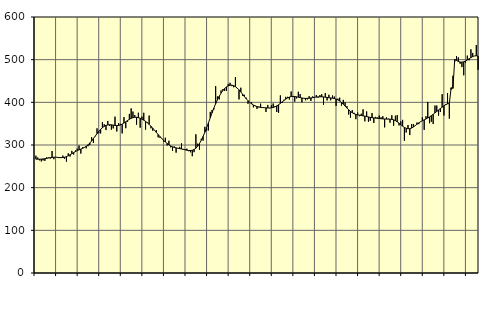
| Category | Piggar | Series 1 |
|---|---|---|
| nan | 274.9 | 266.76 |
| 1.0 | 270.7 | 266.76 |
| 1.0 | 264.1 | 266.82 |
| 1.0 | 261.5 | 266.96 |
| 1.0 | 264 | 267.32 |
| 1.0 | 262.8 | 267.86 |
| 1.0 | 271.2 | 268.57 |
| 1.0 | 270.6 | 269.52 |
| 1.0 | 268 | 270.36 |
| 1.0 | 285.9 | 271.01 |
| 1.0 | 266.7 | 271.34 |
| 1.0 | 271.1 | 271.36 |
| nan | 270.4 | 271.1 |
| 2.0 | 269.3 | 270.68 |
| 2.0 | 271.1 | 270.42 |
| 2.0 | 275.1 | 270.6 |
| 2.0 | 267.8 | 271.37 |
| 2.0 | 261.1 | 272.78 |
| 2.0 | 280.5 | 274.76 |
| 2.0 | 273 | 277.16 |
| 2.0 | 286.3 | 279.71 |
| 2.0 | 277.6 | 282.25 |
| 2.0 | 287.2 | 284.6 |
| 2.0 | 291.5 | 286.7 |
| nan | 298.7 | 288.58 |
| 3.0 | 279.9 | 290.39 |
| 3.0 | 294.8 | 292.26 |
| 3.0 | 295 | 294.38 |
| 3.0 | 292.2 | 297.07 |
| 3.0 | 297.1 | 300.49 |
| 3.0 | 299.8 | 304.65 |
| 3.0 | 318.4 | 309.52 |
| 3.0 | 304.8 | 315.02 |
| 3.0 | 320.2 | 320.77 |
| 3.0 | 339 | 326.52 |
| 3.0 | 327.5 | 331.91 |
| nan | 327.1 | 336.63 |
| 4.0 | 353.4 | 340.6 |
| 4.0 | 348.6 | 343.68 |
| 4.0 | 335 | 345.82 |
| 4.0 | 356.4 | 347.07 |
| 4.0 | 344.6 | 347.5 |
| 4.0 | 336 | 347.3 |
| 4.0 | 338.9 | 346.66 |
| 4.0 | 366.4 | 345.93 |
| 4.0 | 331.7 | 345.59 |
| 4.0 | 351.3 | 345.84 |
| 4.0 | 349.6 | 346.94 |
| nan | 327.2 | 348.92 |
| 5.0 | 365.4 | 351.48 |
| 5.0 | 339.4 | 354.41 |
| 5.0 | 354.5 | 357.47 |
| 5.0 | 372.9 | 360.26 |
| 5.0 | 385.8 | 362.48 |
| 5.0 | 378.4 | 364.04 |
| 5.0 | 370.1 | 364.9 |
| 5.0 | 347.7 | 364.9 |
| 5.0 | 375.6 | 364.09 |
| 5.0 | 340.6 | 362.66 |
| 5.0 | 366.5 | 360.66 |
| nan | 375.5 | 358.22 |
| 6.0 | 336.1 | 355.36 |
| 6.0 | 353.4 | 352.04 |
| 6.0 | 368.9 | 348.28 |
| 6.0 | 339.1 | 344.04 |
| 6.0 | 333.3 | 339.4 |
| 6.0 | 334 | 334.5 |
| 6.0 | 334.7 | 329.5 |
| 6.0 | 317.9 | 324.62 |
| 6.0 | 316.8 | 319.93 |
| 6.0 | 316.4 | 315.39 |
| 6.0 | 308.1 | 311.11 |
| nan | 317.1 | 307.07 |
| 7.0 | 298.7 | 303.42 |
| 7.0 | 310 | 300.32 |
| 7.0 | 294.5 | 297.73 |
| 7.0 | 286.1 | 295.71 |
| 7.0 | 296.6 | 294.33 |
| 7.0 | 282.1 | 293.29 |
| 7.0 | 292.7 | 292.37 |
| 7.0 | 295.6 | 291.51 |
| 7.0 | 303.9 | 290.65 |
| 7.0 | 290.8 | 289.76 |
| 7.0 | 290.6 | 288.76 |
| nan | 291.3 | 287.78 |
| 8.0 | 285.4 | 287.1 |
| 8.0 | 282.8 | 286.96 |
| 8.0 | 273.7 | 287.58 |
| 8.0 | 283.2 | 289.35 |
| 8.0 | 325 | 292.53 |
| 8.0 | 303.2 | 297.2 |
| 8.0 | 289 | 303.42 |
| 8.0 | 314.5 | 311.05 |
| 8.0 | 310.3 | 319.9 |
| 8.0 | 342.7 | 329.81 |
| 8.0 | 333.6 | 340.63 |
| nan | 334 | 352.04 |
| 9.0 | 377.6 | 363.68 |
| 9.0 | 382.2 | 375.25 |
| 9.0 | 383.2 | 386.45 |
| 9.0 | 438 | 396.85 |
| 9.0 | 413.8 | 406.14 |
| 9.0 | 406.9 | 414.33 |
| 9.0 | 427.8 | 421.45 |
| 9.0 | 430.9 | 427.51 |
| 9.0 | 426.6 | 432.4 |
| 9.0 | 427 | 436.12 |
| 9.0 | 443 | 438.66 |
| nan | 445.8 | 440.07 |
| 10.0 | 438 | 440.26 |
| 10.0 | 435.3 | 439.14 |
| 10.0 | 459.4 | 436.83 |
| 10.0 | 432.9 | 433.5 |
| 10.0 | 406.9 | 429.27 |
| 10.0 | 434.3 | 424.32 |
| 10.0 | 415.1 | 418.98 |
| 10.0 | 417.6 | 413.55 |
| 10.0 | 410.9 | 408.44 |
| 10.0 | 396.5 | 403.85 |
| 10.0 | 399.8 | 399.89 |
| nan | 400.1 | 396.52 |
| 11.0 | 388.2 | 393.74 |
| 11.0 | 392.4 | 391.54 |
| 11.0 | 384.5 | 389.89 |
| 11.0 | 390.2 | 388.8 |
| 11.0 | 396.9 | 388.16 |
| 11.0 | 387.1 | 387.78 |
| 11.0 | 387 | 387.43 |
| 11.0 | 377.5 | 387.1 |
| 11.0 | 393.9 | 386.81 |
| 11.0 | 386.2 | 386.76 |
| 11.0 | 392.9 | 387.07 |
| nan | 397.2 | 387.9 |
| 12.0 | 390.7 | 389.4 |
| 12.0 | 377.3 | 391.64 |
| 12.0 | 375.6 | 394.47 |
| 12.0 | 416.2 | 397.66 |
| 12.0 | 398.5 | 401.02 |
| 12.0 | 406.1 | 404.36 |
| 12.0 | 412.8 | 407.5 |
| 12.0 | 412.9 | 410.23 |
| 12.0 | 406.6 | 412.3 |
| 12.0 | 425.4 | 413.56 |
| 12.0 | 412.5 | 414 |
| nan | 401.7 | 413.72 |
| 13.0 | 409.2 | 412.94 |
| 13.0 | 424.8 | 411.95 |
| 13.0 | 419.3 | 410.99 |
| 13.0 | 400.1 | 410.14 |
| 13.0 | 409.2 | 409.51 |
| 13.0 | 404.8 | 409.24 |
| 13.0 | 406.9 | 409.34 |
| 13.0 | 414.3 | 409.71 |
| 13.0 | 403.3 | 410.31 |
| 13.0 | 413.9 | 411 |
| 13.0 | 412.4 | 411.63 |
| nan | 417.2 | 412.27 |
| 14.0 | 411 | 412.8 |
| 14.0 | 416.9 | 413.02 |
| 14.0 | 419 | 412.92 |
| 14.0 | 394.3 | 412.59 |
| 14.0 | 421.9 | 412.09 |
| 14.0 | 404.5 | 411.47 |
| 14.0 | 417.8 | 410.85 |
| 14.0 | 404.7 | 410.3 |
| 14.0 | 416.1 | 409.69 |
| 14.0 | 413.6 | 408.83 |
| 14.0 | 391.6 | 407.54 |
| nan | 408.8 | 405.63 |
| 15.0 | 410.9 | 403 |
| 15.0 | 392.3 | 399.65 |
| 15.0 | 405.8 | 395.62 |
| 15.0 | 400.1 | 391.24 |
| 15.0 | 391.1 | 386.78 |
| 15.0 | 371.5 | 382.51 |
| 15.0 | 363.9 | 378.78 |
| 15.0 | 381.5 | 375.66 |
| 15.0 | 375.5 | 373.29 |
| 15.0 | 360.5 | 371.61 |
| 15.0 | 376 | 370.51 |
| nan | 367.5 | 369.79 |
| 16.0 | 373.3 | 369.14 |
| 16.0 | 383.6 | 368.39 |
| 16.0 | 355.5 | 367.59 |
| 16.0 | 378.7 | 366.66 |
| 16.0 | 354.6 | 365.67 |
| 16.0 | 356.8 | 364.79 |
| 16.0 | 374.8 | 364.06 |
| 16.0 | 351.6 | 363.5 |
| 16.0 | 365.9 | 363.01 |
| 16.0 | 364.4 | 362.53 |
| 16.0 | 369.1 | 362.1 |
| nan | 364.9 | 361.67 |
| 17.0 | 367.5 | 361.21 |
| 17.0 | 341.3 | 360.88 |
| 17.0 | 364.6 | 360.74 |
| 17.0 | 361.6 | 360.69 |
| 17.0 | 352.4 | 360.55 |
| 17.0 | 369.7 | 360.09 |
| 17.0 | 345.2 | 358.99 |
| 17.0 | 368.6 | 357.11 |
| 17.0 | 370.1 | 354.49 |
| 17.0 | 345.9 | 351.24 |
| 17.0 | 355.4 | 347.67 |
| nan | 358.9 | 344.12 |
| 18.0 | 310 | 341.16 |
| 18.0 | 329.2 | 339.17 |
| 18.0 | 346.9 | 338.2 |
| 18.0 | 323.3 | 338.34 |
| 18.0 | 349.1 | 339.69 |
| 18.0 | 349.3 | 342.19 |
| 18.0 | 344.9 | 345.36 |
| 18.0 | 352.7 | 348.7 |
| 18.0 | 348.9 | 351.82 |
| 18.0 | 354.2 | 354.62 |
| 18.0 | 364.8 | 356.96 |
| nan | 335.5 | 359 |
| 19.0 | 367.4 | 361.05 |
| 19.0 | 400.9 | 363.24 |
| 19.0 | 351 | 365.77 |
| 19.0 | 354.7 | 368.71 |
| 19.0 | 349.3 | 371.92 |
| 19.0 | 392.4 | 375.27 |
| 19.0 | 392.4 | 378.69 |
| 19.0 | 368.9 | 382.1 |
| 19.0 | 377.3 | 385.45 |
| 19.0 | 419.2 | 388.72 |
| 19.0 | 369.1 | 391.84 |
| nan | 396 | 394.56 |
| 20.0 | 421.7 | 396.46 |
| 20.0 | 361.7 | 397.18 |
| 20.0 | 429.9 | 434.21 |
| 20.0 | 462.3 | 432.76 |
| 20.0 | 495.2 | 500.55 |
| 20.0 | 508.4 | 498.12 |
| 20.0 | 505.5 | 495.89 |
| 20.0 | 490.4 | 494.47 |
| 20.0 | 482.6 | 494.16 |
| 20.0 | 463.4 | 494.96 |
| 20.0 | 492.2 | 496.71 |
| nan | 509.5 | 499.23 |
| 21.0 | 498.5 | 502.06 |
| 21.0 | 524.3 | 504.84 |
| 21.0 | 515.8 | 507.27 |
| 21.0 | 508.8 | 508.76 |
| 21.0 | 534.4 | 509.12 |
| 21.0 | 476.3 | 508.49 |